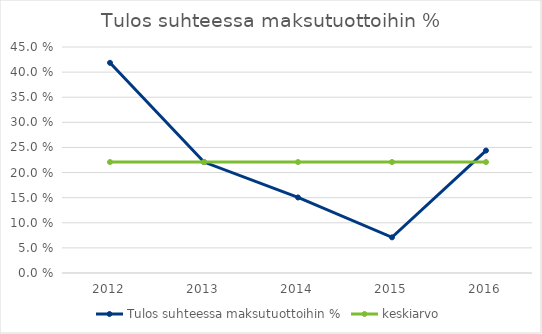
| Category | Tulos suhteessa maksutuottoihin % | keskiarvo |
|---|---|---|
| 2012.0 | 0.419 | 0.221 |
| 2013.0 | 0.221 | 0.221 |
| 2014.0 | 0.15 | 0.221 |
| 2015.0 | 0.071 | 0.221 |
| 2016.0 | 0.244 | 0.221 |